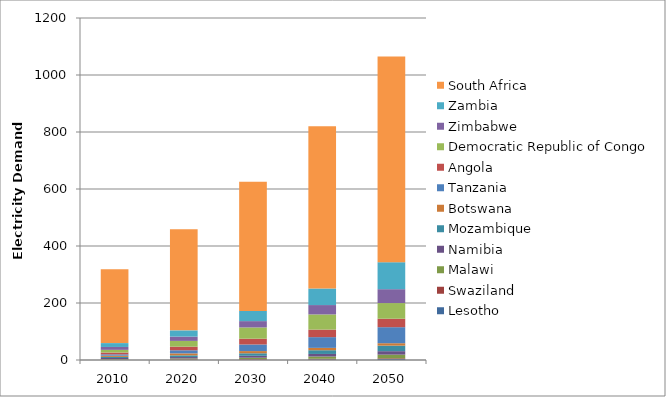
| Category | Lesotho | Swaziland | Malawi | Namibia | Mozambique | Botswana | Tanzania | Angola | Democratic Republic of Congo | Zimbabwe | Zambia | South Africa |
|---|---|---|---|---|---|---|---|---|---|---|---|---|
| 2010.0 | 0.576 | 1.262 | 1.6 | 3.648 | 3.758 | 4.202 | 4.82 | 6.343 | 9.39 | 10.142 | 13.509 | 258.87 |
| 2020.0 | 0.866 | 1.72 | 2.995 | 4.804 | 5.966 | 6.848 | 10.896 | 12.674 | 20.272 | 15.013 | 21.899 | 354.899 |
| 2030.0 | 1.309 | 1.952 | 4.879 | 6.608 | 8.84 | 7.73 | 23.09 | 20.294 | 39.492 | 22.222 | 35.671 | 453.069 |
| 2040.0 | 2.023 | 2.279 | 7.948 | 8.961 | 13.103 | 8.273 | 37.611 | 26.5 | 53.168 | 32.895 | 58.104 | 569.336 |
| 2050.0 | 3.155 | 2.719 | 12.946 | 12.153 | 19.42 | 8.486 | 56.259 | 29.668 | 54.952 | 48.692 | 94.645 | 722.24 |